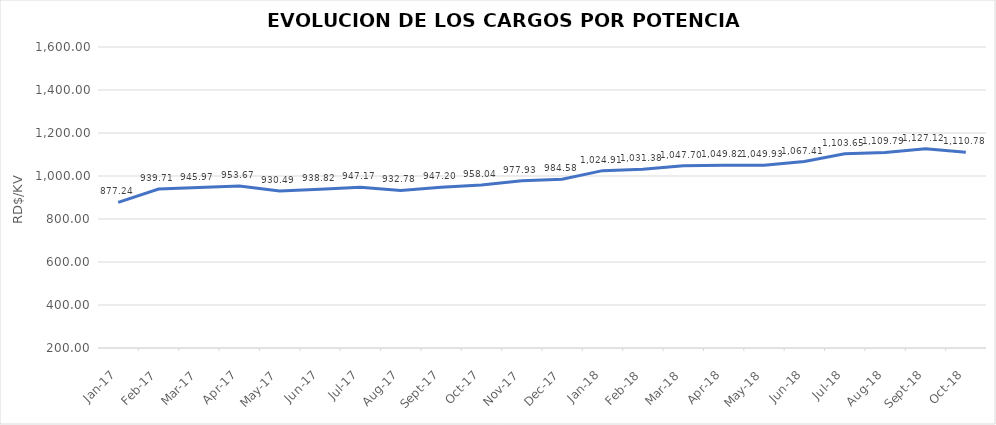
| Category | Series 0 |
|---|---|
| 2017-01-01 | 877.236 |
| 2017-02-01 | 939.71 |
| 2017-03-01 | 945.975 |
| 2017-04-01 | 953.67 |
| 2017-05-01 | 930.49 |
| 2017-06-01 | 938.816 |
| 2017-07-01 | 947.169 |
| 2017-08-01 | 932.783 |
| 2017-09-01 | 947.198 |
| 2017-10-01 | 958.035 |
| 2017-11-01 | 977.934 |
| 2017-12-01 | 984.584 |
| 2018-01-01 | 1024.909 |
| 2018-02-01 | 1031.38 |
| 2018-03-01 | 1047.702 |
| 2018-04-01 | 1049.816 |
| 2018-05-01 | 1049.93 |
| 2018-06-01 | 1067.413 |
| 2018-07-01 | 1103.655 |
| 2018-08-01 | 1109.786 |
| 2018-09-01 | 1127.117 |
| 2018-10-01 | 1110.779 |